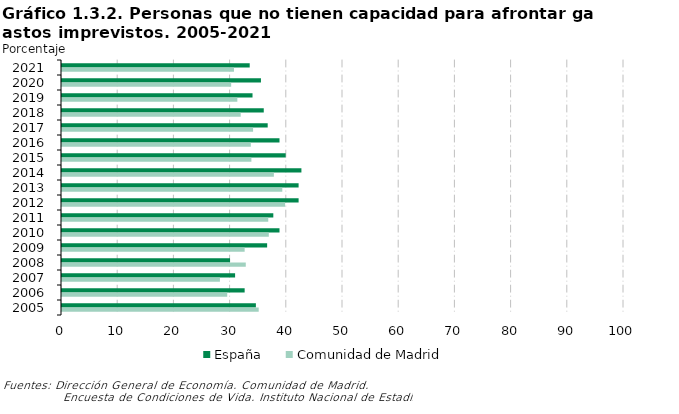
| Category | España | Comunidad de Madrid |
|---|---|---|
| 2021 | 33.4 | 30.6 |
| 2020 | 35.4 | 30.1 |
| 2019 | 33.9 | 31.2 |
| 2018 | 35.9 | 31.8 |
| 2017 | 36.6 | 34 |
| 2016 | 38.7 | 33.6 |
| 2015 | 39.8 | 33.7 |
| 2014 | 42.6 | 37.7 |
| 2013 | 42.1 | 39.2 |
| 2012 | 42.1 | 39.7 |
| 2011 | 37.6 | 36.7 |
| 2010 | 38.7 | 36.8 |
| 2009 | 36.5 | 32.5 |
| 2008 | 29.9 | 32.7 |
| 2007 | 30.8 | 28.1 |
| 2006 | 32.5 | 29.4 |
| 2005 | 34.5 | 35 |